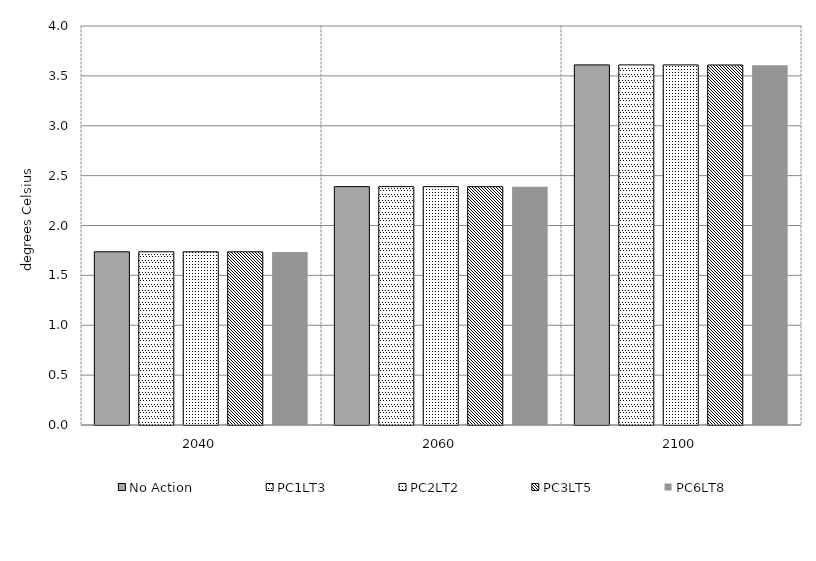
| Category | No Action | PC1LT3 | PC2LT2 | PC3LT5 | PC6LT8 | Alt 5 | Alt 6 | Alt 7 | Alt 8 | Alt 10 |
|---|---|---|---|---|---|---|---|---|---|---|
| 2040.0 | 1.737 | 1.736 | 1.736 | 1.736 | 1.735 |  |  |  |  |  |
| 2060.0 | 2.39 | 2.39 | 2.389 | 2.389 | 2.388 |  |  |  |  |  |
| 2100.0 | 3.61 | 3.61 | 3.61 | 3.609 | 3.608 |  |  |  |  |  |